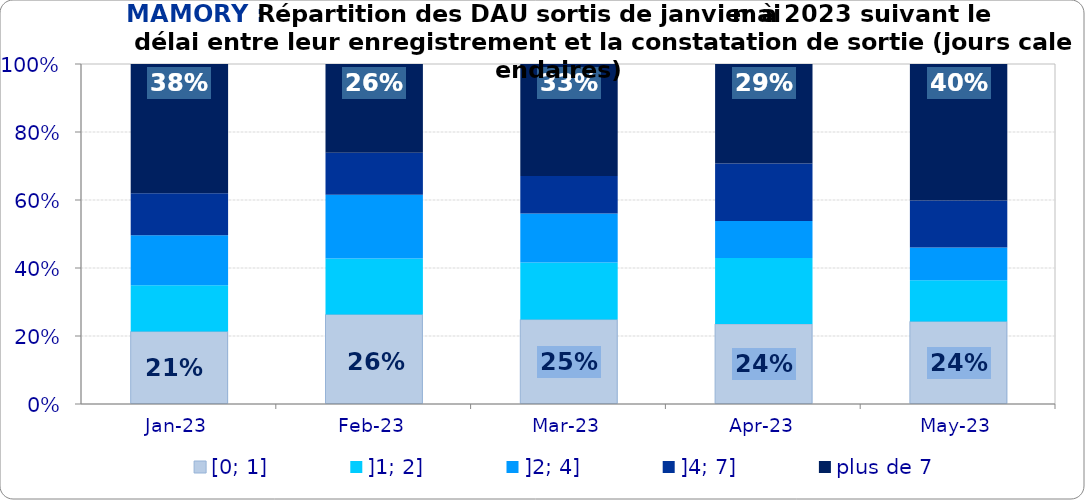
| Category | [0; 1] | ]1; 2] | ]2; 4] | ]4; 7] | plus de 7 |
|---|---|---|---|---|---|
| 2023-01-01 | 0.213 | 0.136 | 0.148 | 0.123 | 0.38 |
| 2023-02-01 | 0.263 | 0.165 | 0.187 | 0.123 | 0.261 |
| 2023-03-01 | 0.248 | 0.168 | 0.145 | 0.11 | 0.329 |
| 2023-04-01 | 0.235 | 0.194 | 0.109 | 0.169 | 0.293 |
| 2023-05-01 | 0.243 | 0.121 | 0.096 | 0.138 | 0.402 |